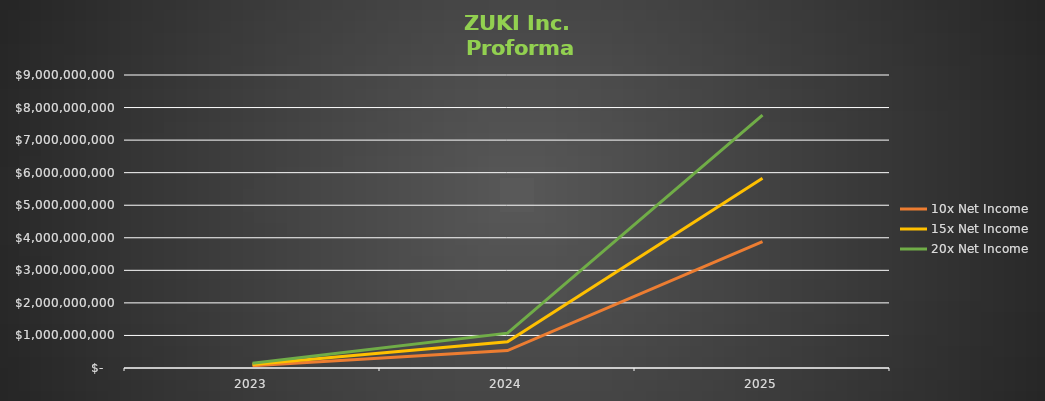
| Category | 10x Net Income | 15x Net Income | 20x Net Income |
|---|---|---|---|
| 2023 | 71400233.962 | 107100350.943 | 142800467.924 |
| 2024 | 535561981.711 | 803342972.566 | 1071123963.421 |
| 2025 | 3884213771.294 | 5826320656.942 | 7768427542.589 |